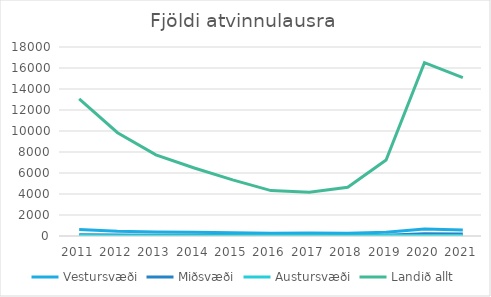
| Category | Vestursvæði | Miðsvæði | Austursvæði | Landið allt |
|---|---|---|---|---|
| 2011.0 | 622 | 118 | 38 | 13066.333 |
| 2012.0 | 445 | 94 | 26 | 9838 |
| 2013.0 | 384 | 75 | 26 | 7726.833 |
| 2014.0 | 360 | 67 | 33 | 6474.333 |
| 2015.0 | 310 | 55 | 31 | 5341.833 |
| 2016.0 | 269 | 34 | 32 | 4324.5 |
| 2017.0 | 274 | 32 | 34 | 4171.167 |
| 2018.0 | 262 | 44 | 25 | 4642.917 |
| 2019.0 | 352 | 74 | 40 | 7237.75 |
| 2020.0 | 671 | 221 | 47 | 16511 |
| 2021.0 | 573 | 180 | 41 | 15082 |